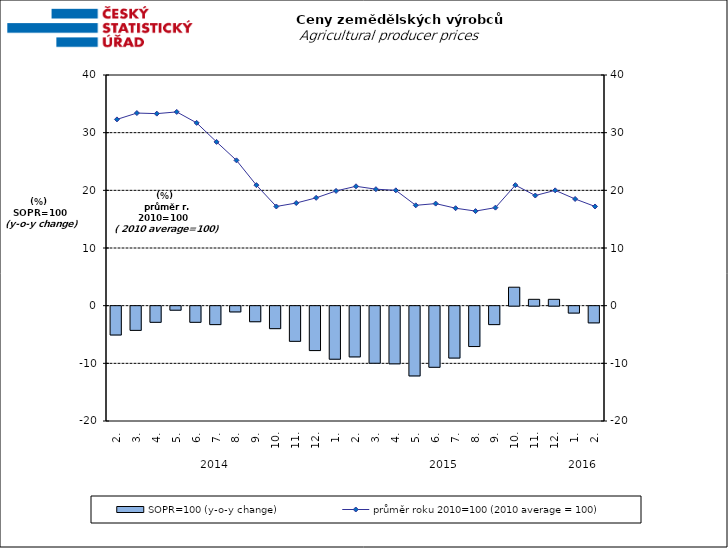
| Category | SOPR=100 (y-o-y change)   |
|---|---|
| 0 | -5 |
| 1 | -4.2 |
| 2 | -2.8 |
| 3 | -0.7 |
| 4 | -2.8 |
| 5 | -3.2 |
| 6 | -1 |
| 7 | -2.7 |
| 8 | -3.9 |
| 9 | -6.1 |
| 10 | -7.7 |
| 11 | -9.2 |
| 12 | -8.8 |
| 13 | -9.9 |
| 14 | -10 |
| 15 | -12.1 |
| 16 | -10.6 |
| 17 | -9 |
| 18 | -7 |
| 19 | -3.2 |
| 20 | 3.2 |
| 21 | 1.1 |
| 22 | 1.1 |
| 23 | -1.2 |
| 24 | -2.9 |